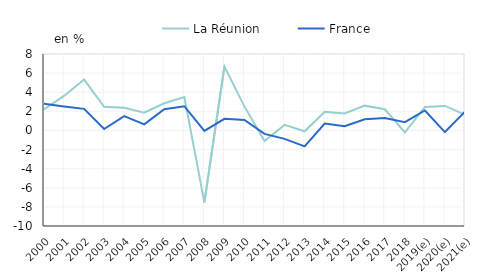
| Category | La Réunion | France |
|---|---|---|
| 2000 | 2.199 | 2.787 |
| 2001 | 3.613 | 2.503 |
| 2002 | 5.326 | 2.26 |
| 2003 | 2.478 | 0.146 |
| 2004 | 2.375 | 1.492 |
| 2005 | 1.852 | 0.631 |
| 2006 | 2.846 | 2.221 |
| 2007 | 3.489 | 2.536 |
| 2008 | -7.525 | -0.048 |
| 2009 | 6.69 | 1.211 |
| 2010 | 2.493 | 1.089 |
| 2011 | -1.099 | -0.362 |
| 2012 | 0.582 | -0.884 |
| 2013 | -0.083 | -1.67 |
| 2014 | 1.94 | 0.719 |
| 2015 | 1.774 | 0.439 |
| 2016 | 2.594 | 1.177 |
| 2017 | 2.214 | 1.3 |
| 2018 | -0.211 | 0.87 |
| 2019(e) | 2.465 | 2.09 |
| 2020(e) | 2.565 | -0.17 |
| 2021(e) | 1.646 | 1.97 |